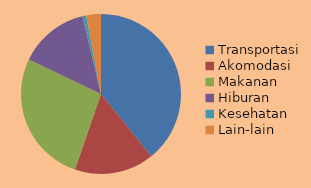
| Category | Series 0 | Series 1 | Series 2 |
|---|---|---|---|
| Transportasi | 0.392 | 26300000 | 0.392 |
| Akomodasi | 0.161 | 10800000 | 0.161 |
| Makanan | 0.268 | 18000000 | 0.268 |
| Hiburan | 0.142 | 9500000 | 0.142 |
| Kesehatan | 0.007 | 500000 | 0.007 |
| Lain-lain | 0.03 | 2000000 | 0.03 |